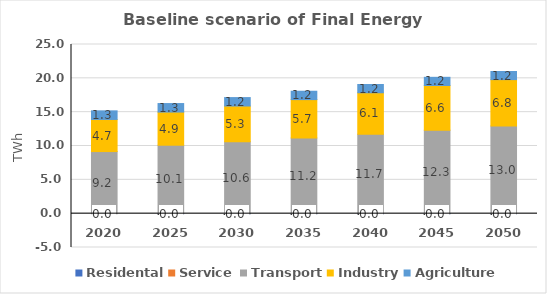
| Category | Residental | Service | Transport | Industry | Agriculture |
|---|---|---|---|---|---|
| 2020.0 | 0 | 0 | 9.178 | 4.745 | 1.273 |
| 2025.0 | 0 | 0 | 10.116 | 4.898 | 1.26 |
| 2030.0 | 0 | 0 | 10.632 | 5.276 | 1.247 |
| 2035.0 | 0 | 0 | 11.174 | 5.684 | 1.235 |
| 2040.0 | 0 | 0 | 11.744 | 6.124 | 1.223 |
| 2045.0 | 0 | 0 | 12.343 | 6.597 | 1.21 |
| 2050.0 | 0 | 0 | 12.972 | 6.839 | 1.198 |